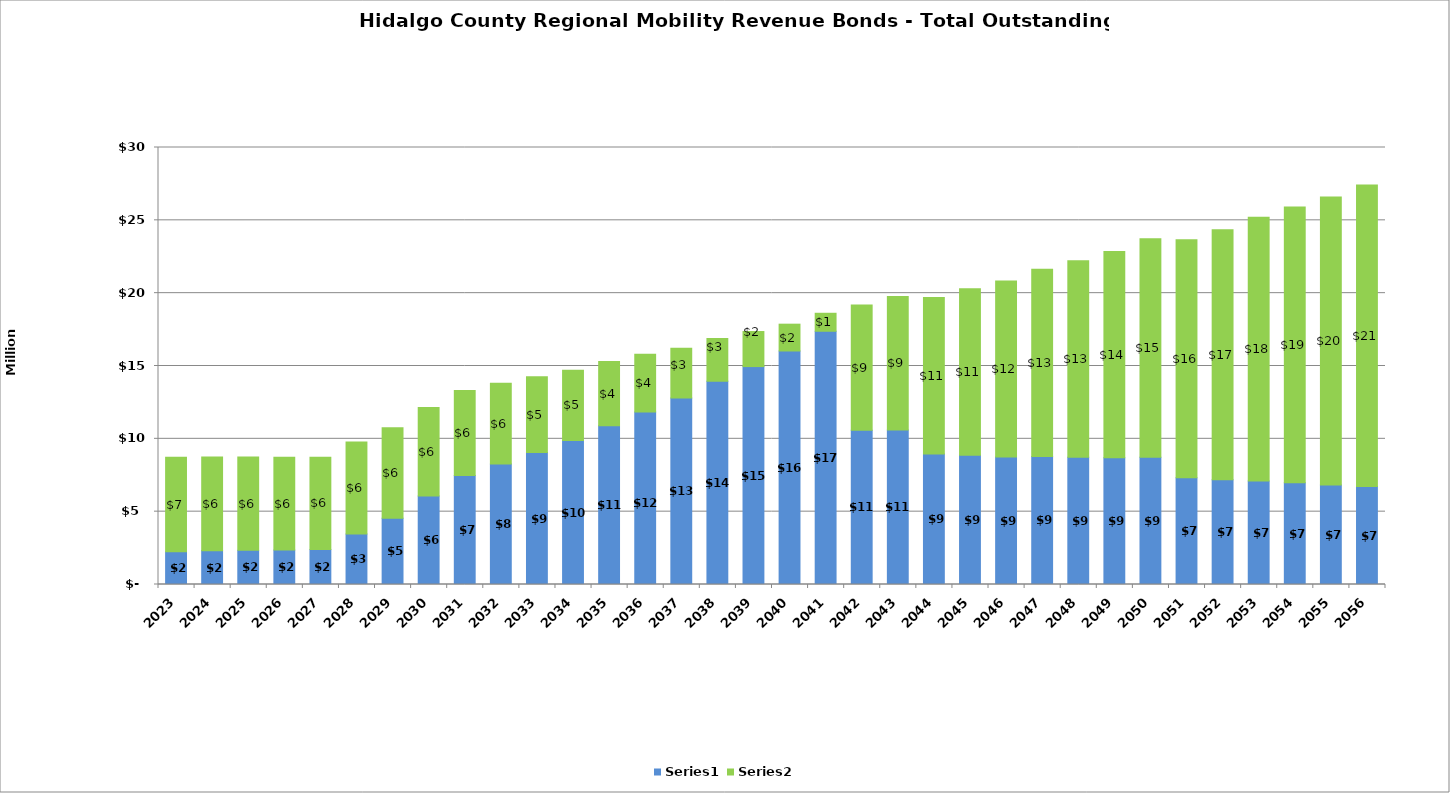
| Category | Series 1 | Series 2 |
|---|---|---|
| 2023.0 | 2240000 | 6500354 |
| 2024.0 | 2325000 | 6422567 |
| 2025.0 | 2345000 | 6400154 |
| 2026.0 | 2365000 | 6375204 |
| 2027.0 | 2400000 | 6342945 |
| 2028.0 | 3475000 | 6307809 |
| 2029.0 | 4550000 | 6214852 |
| 2030.0 | 6080000 | 6066998 |
| 2031.0 | 7480000 | 5841571 |
| 2032.0 | 8270000 | 5545134 |
| 2033.0 | 9055000 | 5208232 |
| 2034.0 | 9880000 | 4832057 |
| 2035.0 | 10895000 | 4413624 |
| 2036.0 | 11835000 | 3973724 |
| 2037.0 | 12805000 | 3411586 |
| 2038.0 | 13955000 | 2931373 |
| 2039.0 | 14960000 | 2406085 |
| 2040.0 | 16030000 | 1841576 |
| 2041.0 | 17385000 | 1235247 |
| 2042.0 | 10583969 | 8604803 |
| 2043.0 | 10602665 | 9165206 |
| 2044.0 | 8964858 | 10734142 |
| 2045.0 | 8865409 | 11440491 |
| 2046.0 | 8756327 | 12080273 |
| 2047.0 | 8793776 | 12849024 |
| 2048.0 | 8738234 | 13483566 |
| 2049.0 | 8697930 | 14155670 |
| 2050.0 | 8729680 | 15003320 |
| 2051.0 | 7331985 | 16343016 |
| 2052.0 | 7185315 | 17159685 |
| 2053.0 | 7109446 | 18105554 |
| 2054.0 | 6977333 | 18932668 |
| 2055.0 | 6837360 | 19757640 |
| 2056.0 | 6725765 | 20704232 |